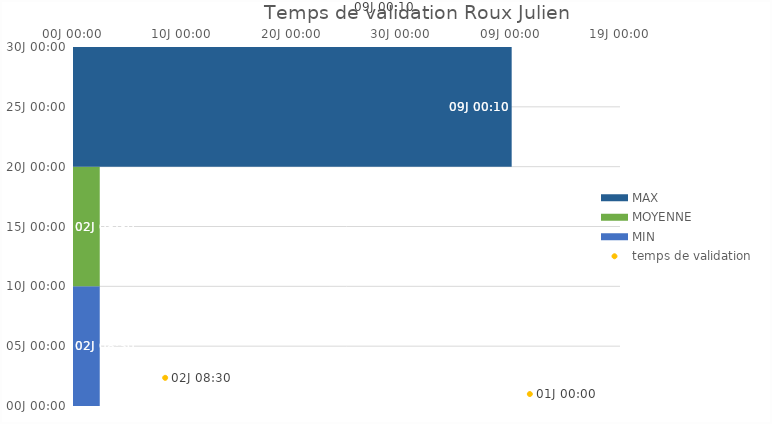
| Category | MIN  | MOYENNE | MAX |
|---|---|---|---|
| Roux Julien  | 08:30 | 08:30 | 00:10 |